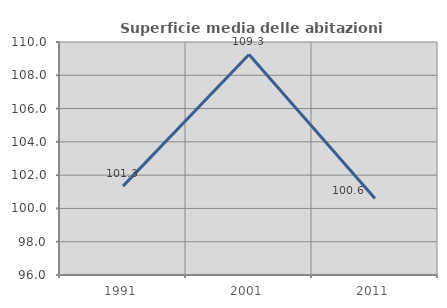
| Category | Superficie media delle abitazioni occupate |
|---|---|
| 1991.0 | 101.342 |
| 2001.0 | 109.251 |
| 2011.0 | 100.598 |